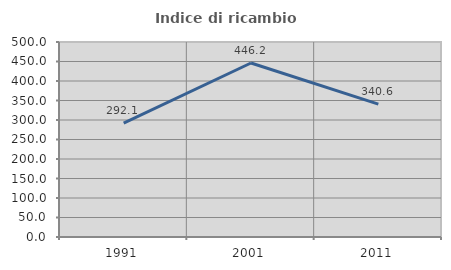
| Category | Indice di ricambio occupazionale  |
|---|---|
| 1991.0 | 292.105 |
| 2001.0 | 446.154 |
| 2011.0 | 340.625 |